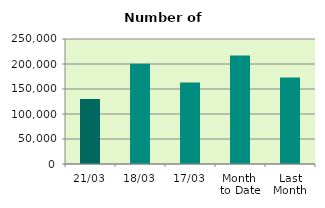
| Category | Series 0 |
|---|---|
| 21/03 | 130012 |
| 18/03 | 200514 |
| 17/03 | 162778 |
| Month 
to Date | 217152.533 |
| Last
Month | 173197.3 |